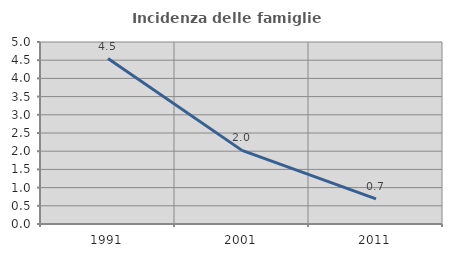
| Category | Incidenza delle famiglie numerose |
|---|---|
| 1991.0 | 4.545 |
| 2001.0 | 2.022 |
| 2011.0 | 0.69 |